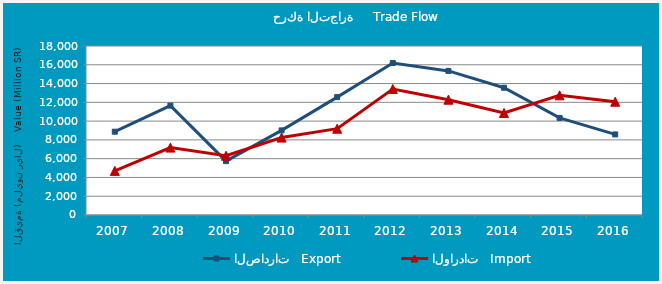
| Category | الصادرات   Export | الواردات   Import |
|---|---|---|
| 2007.0 | 8872.385 | 4698.686 |
| 2008.0 | 11649.575 | 7180.867 |
| 2009.0 | 5737.119 | 6313.541 |
| 2010.0 | 9011.63 | 8245.95 |
| 2011.0 | 12555.354 | 9192.316 |
| 2012.0 | 16187.192 | 13422.272 |
| 2013.0 | 15346.281 | 12283.001 |
| 2014.0 | 13557.545 | 10866.759 |
| 2015.0 | 10338.461 | 12744.514 |
| 2016.0 | 8581.68 | 12063.866 |